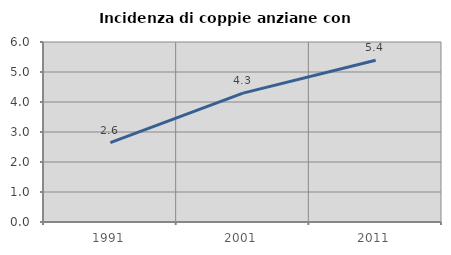
| Category | Incidenza di coppie anziane con figli |
|---|---|
| 1991.0 | 2.645 |
| 2001.0 | 4.295 |
| 2011.0 | 5.39 |